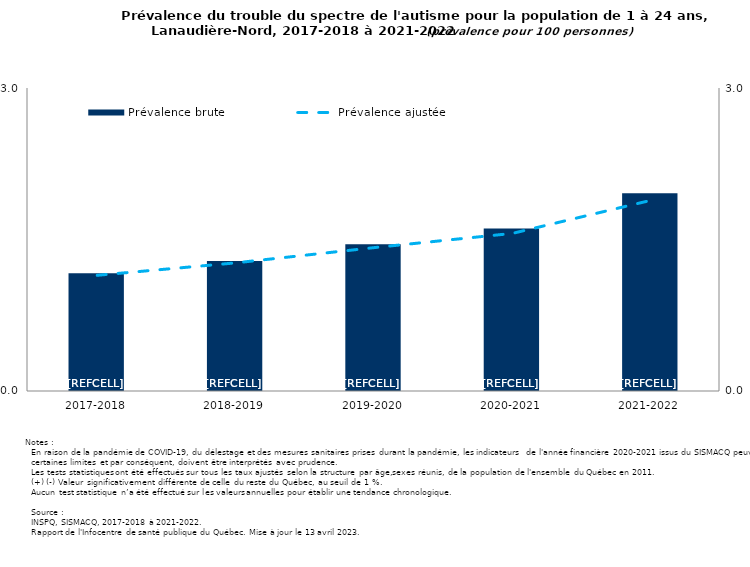
| Category | Prévalence brute |
|---|---|
| 2017-2018 | 1.165 |
| 2018-2019 | 1.287 |
| 2019-2020 | 1.452 |
| 2020-2021 | 1.61 |
| 2021-2022 | 1.958 |